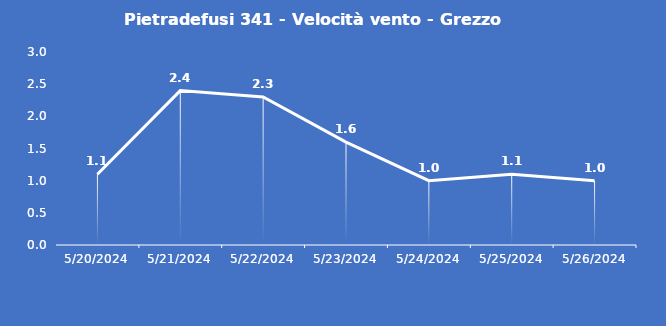
| Category | Pietradefusi 341 - Velocità vento - Grezzo (m/s) |
|---|---|
| 5/20/24 | 1.1 |
| 5/21/24 | 2.4 |
| 5/22/24 | 2.3 |
| 5/23/24 | 1.6 |
| 5/24/24 | 1 |
| 5/25/24 | 1.1 |
| 5/26/24 | 1 |